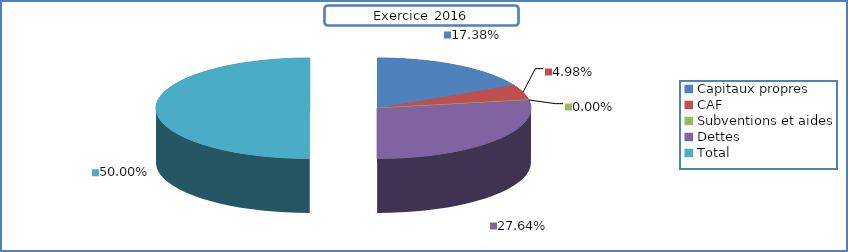
| Category | Series 0 |
|---|---|
| Capitaux propres | 40000 |
| CAF | 11466.5 |
| Subventions et aides | 0 |
| Dettes | 63639.183 |
| Total | 115105.683 |